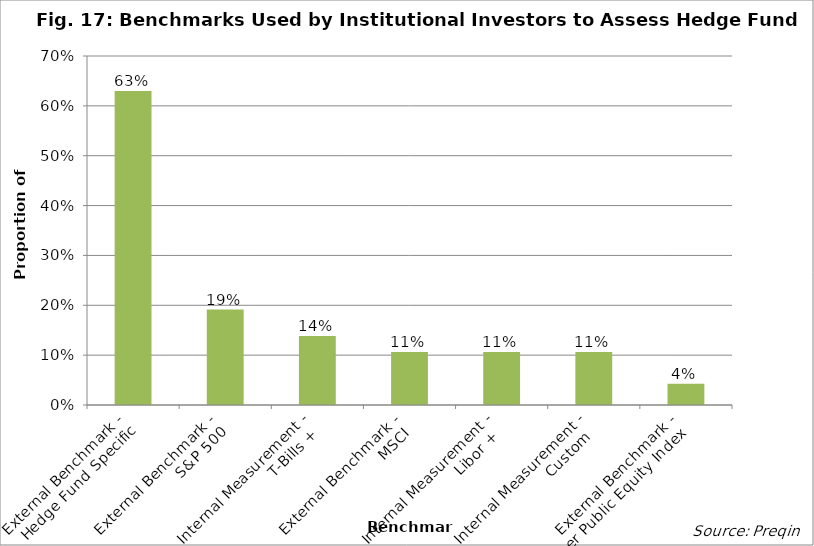
| Category | Proportion |
|---|---|
| External Benchmark -
Hedge Fund Specific | 0.63 |
| External Benchmark -
S&P 500 | 0.191 |
| Internal Measurement -
T-Bills + | 0.138 |
| External Benchmark -
MSCI | 0.106 |
| Internal Measurement -
Libor +  | 0.106 |
| Internal Measurement -
Custom  | 0.106 |
| External Benchmark -
Other Public Equity Index  | 0.043 |